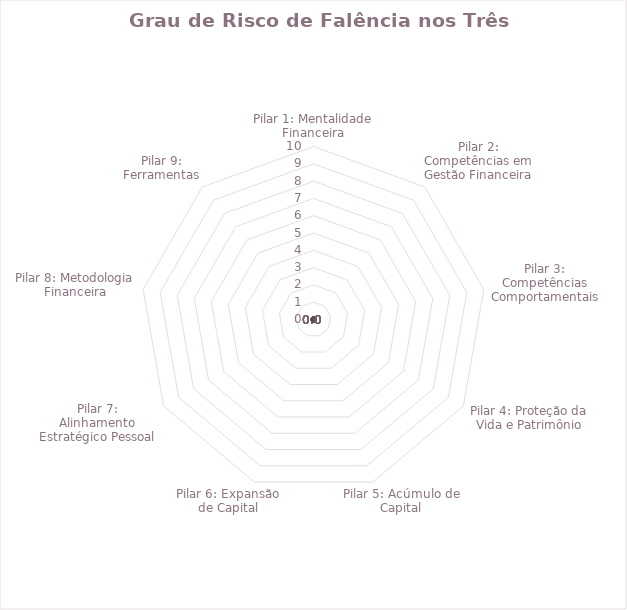
| Category | Série1 |
|---|---|
| Pilar 1: Mentalidade Financeira | 0 |
| Pilar 2: Competências em Gestão Financeira | 0 |
| Pilar 3: Competências Comportamentais | 0 |
| Pilar 4: Proteção da Vida e Patrimônio | 0 |
| Pilar 5: Acúmulo de Capital | 0 |
| Pilar 6: Expansão de Capital | 0 |
| Pilar 7: Alinhamento Estratégico Pessoal | 0 |
| Pilar 8: Metodologia Financeira | 0 |
| Pilar 9: Ferramentas | 0 |